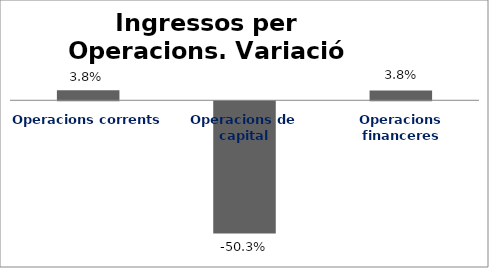
| Category | Series 0 |
|---|---|
| Operacions corrents | 0.038 |
| Operacions de capital | -0.503 |
| Operacions financeres | 0.038 |